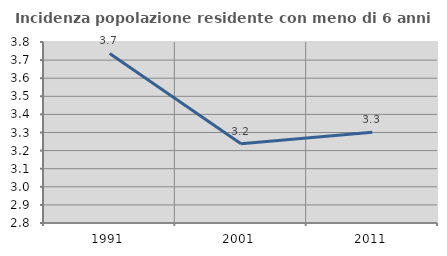
| Category | Incidenza popolazione residente con meno di 6 anni |
|---|---|
| 1991.0 | 3.737 |
| 2001.0 | 3.237 |
| 2011.0 | 3.301 |